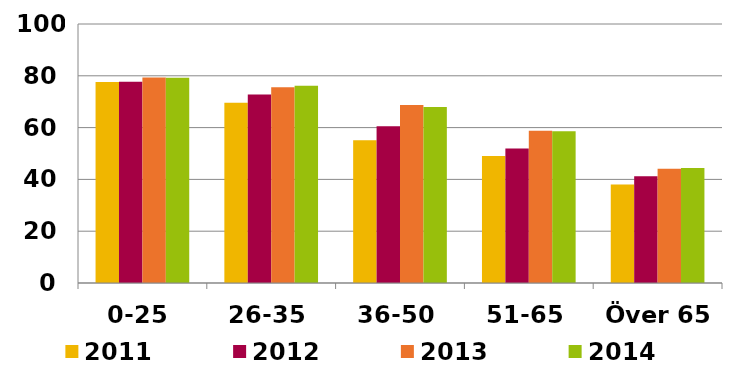
| Category | 2011 | 2012 | 2013 | 2014 |
|---|---|---|---|---|
| 0-25 | 77.606 | 77.737 | 79.3 | 79.209 |
| 26-35 | 69.626 | 72.821 | 75.552 | 76.182 |
| 36-50 | 55.07 | 60.481 | 68.711 | 67.998 |
| 51-65 | 48.99 | 51.963 | 58.781 | 58.611 |
| Över 65 | 38.002 | 41.224 | 44.141 | 44.416 |